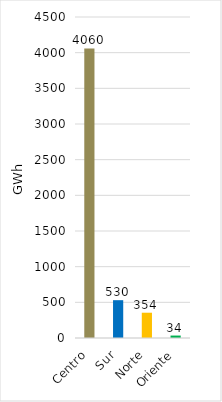
| Category | Series 0 |
|---|---|
| Centro | 4059.96 |
| Sur | 530.078 |
| Norte | 354.438 |
| Oriente | 34.28 |